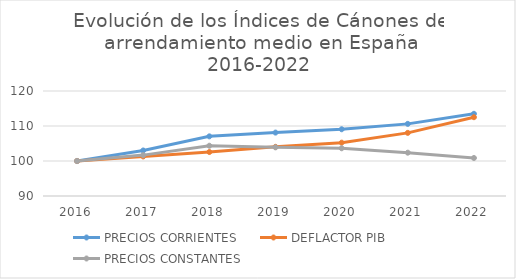
| Category | PRECIOS CORRIENTES | DEFLACTOR PIB | PRECIOS CONSTANTES |
|---|---|---|---|
| 2016.0 | 100 | 100 | 100 |
| 2017.0 | 103.003 | 101.3 | 101.681 |
| 2018.0 | 107.042 | 102.566 | 104.364 |
| 2019.0 | 108.117 | 104.053 | 103.905 |
| 2020.0 | 109.068 | 105.24 | 103.638 |
| 2021.0 | 110.607 | 108.039 | 102.377 |
| 2022.0 | 113.481 | 112.512 | 100.861 |